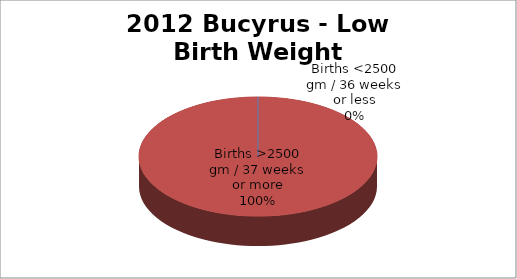
| Category | Series 0 |
|---|---|
| Births <2500 gm / 36 weeks or less | 0 |
| Births >2500 gm / 37 weeks or more | 7 |